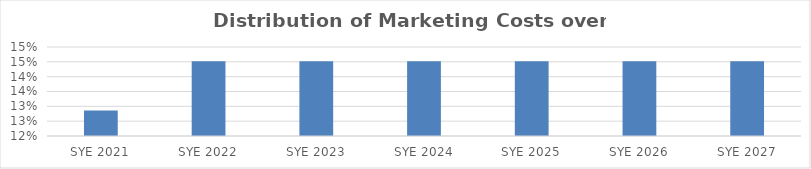
| Category | Series 0 |
|---|---|
| 2021.0 | 0.129 |
| 2022.0 | 0.145 |
| 2023.0 | 0.145 |
| 2024.0 | 0.145 |
| 2025.0 | 0.145 |
| 2026.0 | 0.145 |
| 2027.0 | 0.145 |